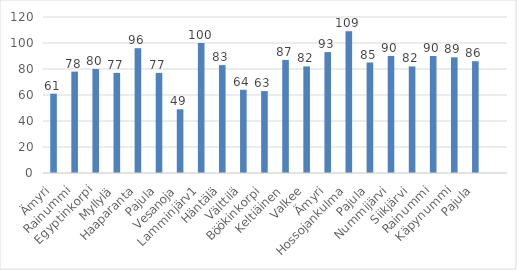
| Category | Series 0 |
|---|---|
| Ämyri | 61 |
| Rainummi | 78 |
| Egyptinkorpi | 80 |
| Myllylä | 77 |
| Haaparanta | 96 |
| Pajula | 77 |
| Vesanoja | 49 |
| Lamminjärv1 | 100 |
| Häntälä | 83 |
| Välttilä | 64 |
| Böökinkorpi | 63 |
| Keltiäinen | 87 |
| Valkee | 82 |
| Ämyri | 93 |
| Hossojankulma | 109 |
| Pajula | 85 |
| Nummijärvi | 90 |
| Siikjärvi | 82 |
| Rainummi | 90 |
| Käpynummi | 89 |
| Pajula | 86 |